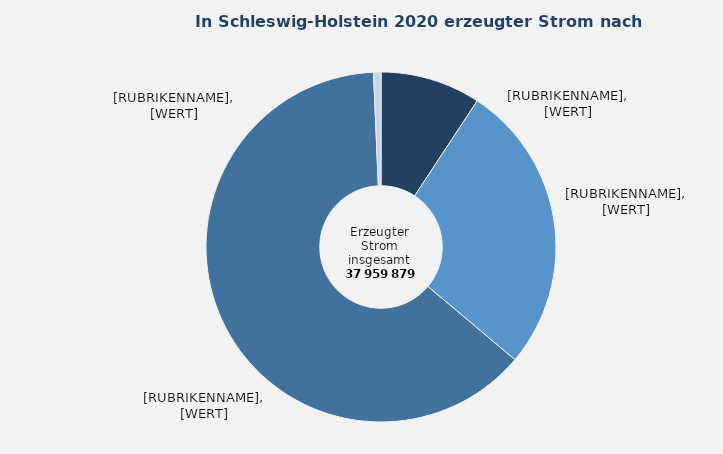
| Category | Anteil in Prozent |
|---|---|
| Fossile Energieträger | 9.268 |
| Kernenergie | 26.867 |
| Erneuerbare Energien | 63.182 |
| Abfälle und sonstige Energieträger | 0.682 |